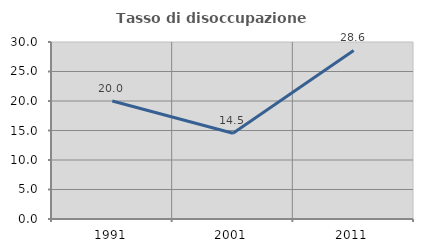
| Category | Tasso di disoccupazione giovanile  |
|---|---|
| 1991.0 | 20 |
| 2001.0 | 14.53 |
| 2011.0 | 28.571 |